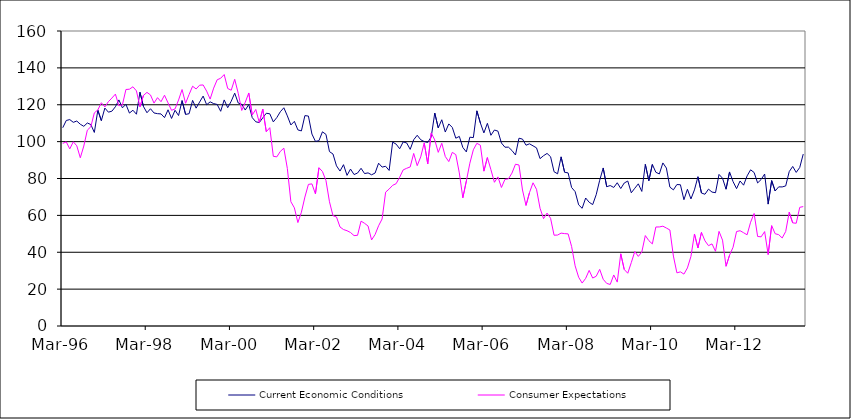
| Category | Current Economic Conditions | Consumer Expectations |
|---|---|---|
| 1996-03-01 | 107.534 | 99.042 |
| 1996-04-01 | 111.468 | 99.873 |
| 1996-05-01 | 111.957 | 96.045 |
| 1996-06-01 | 110.474 | 99.92 |
| 1996-07-01 | 111.168 | 97.726 |
| 1996-08-01 | 109.427 | 91.23 |
| 1996-09-01 | 108.298 | 97.616 |
| 1996-10-01 | 110.108 | 106.207 |
| 1996-11-01 | 109.279 | 108.092 |
| 1996-12-01 | 104.977 | 115.595 |
| 1997-01-01 | 117.038 | 117.194 |
| 1997-02-01 | 111.389 | 121.098 |
| 1997-03-01 | 118.21 | 118.796 |
| 1997-04-01 | 115.979 | 121.671 |
| 1997-05-01 | 116.502 | 123.622 |
| 1997-06-01 | 118.919 | 125.774 |
| 1997-07-01 | 122.622 | 119.453 |
| 1997-08-01 | 118.317 | 119.946 |
| 1997-09-01 | 120.228 | 128.279 |
| 1997-10-01 | 115.49 | 128.434 |
| 1997-11-01 | 117.029 | 129.749 |
| 1997-12-01 | 114.858 | 127.519 |
| 1998-01-01 | 126.797 | 118.85 |
| 1998-02-01 | 119.038 | 125.08 |
| 1998-03-01 | 115.664 | 126.712 |
| 1998-04-01 | 117.832 | 125.305 |
| 1998-05-01 | 115.545 | 120.896 |
| 1998-06-01 | 115.17 | 123.852 |
| 1998-07-01 | 115.024 | 121.661 |
| 1998-08-01 | 113.011 | 125.17 |
| 1998-09-01 | 117.258 | 120.992 |
| 1998-10-01 | 112.572 | 116.994 |
| 1998-11-01 | 117.009 | 117.73 |
| 1998-12-01 | 114.148 | 122.599 |
| 1999-01-01 | 122.261 | 128.24 |
| 1999-02-01 | 114.755 | 120.804 |
| 1999-03-01 | 115.144 | 125.578 |
| 1999-04-01 | 122.37 | 130.05 |
| 1999-05-01 | 118.157 | 128.569 |
| 1999-06-01 | 121.473 | 130.599 |
| 1999-07-01 | 124.698 | 130.738 |
| 1999-08-01 | 120.025 | 127.377 |
| 1999-09-01 | 121.565 | 123.072 |
| 1999-10-01 | 120.628 | 129.024 |
| 1999-11-01 | 120.157 | 133.549 |
| 1999-12-01 | 116.456 | 134.367 |
| 2000-01-01 | 122.625 | 136.39 |
| 2000-02-01 | 118.415 | 128.83 |
| 2000-03-01 | 121.904 | 127.87 |
| 2000-04-01 | 126.291 | 133.808 |
| 2000-05-01 | 120.927 | 126.234 |
| 2000-06-01 | 120.243 | 116.898 |
| 2000-07-01 | 117.132 | 121.315 |
| 2000-08-01 | 120.087 | 126.388 |
| 2000-09-01 | 112.997 | 114.421 |
| 2000-10-01 | 110.759 | 117.451 |
| 2000-11-01 | 110.322 | 110.366 |
| 2000-12-01 | 112.924 | 117.635 |
| 2001-01-01 | 115.391 | 105.36 |
| 2001-02-01 | 115.085 | 107.559 |
| 2001-03-01 | 110.701 | 92.035 |
| 2001-04-01 | 113.07 | 91.744 |
| 2001-05-01 | 116.217 | 94.719 |
| 2001-06-01 | 118.363 | 96.453 |
| 2001-07-01 | 113.96 | 85.411 |
| 2001-08-01 | 109.042 | 67.414 |
| 2001-09-01 | 110.994 | 64.075 |
| 2001-10-01 | 106.361 | 56.085 |
| 2001-11-01 | 105.812 | 61.702 |
| 2001-12-01 | 114.107 | 69.937 |
| 2002-01-01 | 113.87 | 76.81 |
| 2002-02-01 | 104.113 | 77.08 |
| 2002-03-01 | 100.151 | 71.629 |
| 2002-04-01 | 100.503 | 85.831 |
| 2002-05-01 | 105.314 | 83.795 |
| 2002-06-01 | 103.927 | 78.905 |
| 2002-07-01 | 94.586 | 67.374 |
| 2002-08-01 | 93.281 | 59.832 |
| 2002-09-01 | 86.87 | 59.111 |
| 2002-10-01 | 84.038 | 53.696 |
| 2002-11-01 | 87.496 | 52.312 |
| 2002-12-01 | 81.703 | 51.679 |
| 2003-01-01 | 85.115 | 50.696 |
| 2003-02-01 | 82.145 | 49.029 |
| 2003-03-01 | 82.952 | 49.193 |
| 2003-04-01 | 85.542 | 56.879 |
| 2003-05-01 | 82.676 | 55.689 |
| 2003-06-01 | 83.048 | 54.224 |
| 2003-07-01 | 82.005 | 46.672 |
| 2003-08-01 | 82.967 | 49.648 |
| 2003-09-01 | 88.297 | 54.366 |
| 2003-10-01 | 86.186 | 58.069 |
| 2003-11-01 | 86.63 | 72.593 |
| 2003-12-01 | 84.367 | 74.28 |
| 2004-01-01 | 99.728 | 76.295 |
| 2004-02-01 | 98.638 | 77.202 |
| 2004-03-01 | 96.118 | 80.7 |
| 2004-04-01 | 99.845 | 84.661 |
| 2004-05-01 | 99.282 | 85.54 |
| 2004-06-01 | 95.798 | 86.268 |
| 2004-07-01 | 101.024 | 93.601 |
| 2004-08-01 | 103.451 | 86.964 |
| 2004-09-01 | 101.025 | 91.735 |
| 2004-10-01 | 100.027 | 99.325 |
| 2004-11-01 | 99.55 | 87.933 |
| 2004-12-01 | 102.586 | 104.713 |
| 2005-01-01 | 115.494 | 100.93 |
| 2005-02-01 | 107.464 | 94.183 |
| 2005-03-01 | 111.862 | 99.126 |
| 2005-04-01 | 105.202 | 91.93 |
| 2005-05-01 | 109.603 | 89.176 |
| 2005-06-01 | 107.689 | 94.185 |
| 2005-07-01 | 101.855 | 92.95 |
| 2005-08-01 | 102.825 | 83.038 |
| 2005-09-01 | 96.836 | 69.518 |
| 2005-10-01 | 94.419 | 78.597 |
| 2005-11-01 | 102.411 | 88.285 |
| 2005-12-01 | 102.19 | 95.591 |
| 2006-01-01 | 116.697 | 99.091 |
| 2006-02-01 | 110.105 | 98.049 |
| 2006-03-01 | 104.724 | 83.987 |
| 2006-04-01 | 109.919 | 91.366 |
| 2006-05-01 | 103.448 | 84.819 |
| 2006-06-01 | 106.305 | 77.945 |
| 2006-07-01 | 105.691 | 80.872 |
| 2006-08-01 | 99.249 | 75.132 |
| 2006-09-01 | 96.968 | 79.536 |
| 2006-10-01 | 96.994 | 79.805 |
| 2006-11-01 | 95.195 | 82.924 |
| 2006-12-01 | 92.759 | 87.744 |
| 2007-01-01 | 101.857 | 87.327 |
| 2007-02-01 | 101.359 | 73.76 |
| 2007-03-01 | 98.058 | 65.391 |
| 2007-04-01 | 98.812 | 72.362 |
| 2007-05-01 | 97.717 | 77.669 |
| 2007-06-01 | 96.607 | 74.125 |
| 2007-07-01 | 90.78 | 63.876 |
| 2007-08-01 | 92.373 | 58.244 |
| 2007-09-01 | 93.601 | 61.25 |
| 2007-10-01 | 91.814 | 58.415 |
| 2007-11-01 | 83.663 | 49.237 |
| 2007-12-01 | 82.543 | 49.329 |
| 2008-01-01 | 91.739 | 50.379 |
| 2008-02-01 | 83.4 | 50.116 |
| 2008-03-01 | 83.026 | 49.951 |
| 2008-04-01 | 75.099 | 43.093 |
| 2008-05-01 | 72.873 | 32.628 |
| 2008-06-01 | 65.708 | 26.435 |
| 2008-07-01 | 63.831 | 23.287 |
| 2008-08-01 | 69.423 | 25.847 |
| 2008-09-01 | 67.118 | 30.157 |
| 2008-10-01 | 65.853 | 26.003 |
| 2008-11-01 | 71.218 | 26.977 |
| 2008-12-01 | 79.045 | 30.712 |
| 2009-01-01 | 85.714 | 25.335 |
| 2009-02-01 | 75.564 | 23.103 |
| 2009-03-01 | 76.17 | 22.534 |
| 2009-04-01 | 75.15 | 27.683 |
| 2009-05-01 | 77.695 | 23.806 |
| 2009-06-01 | 74.567 | 39.148 |
| 2009-07-01 | 77.567 | 30.628 |
| 2009-08-01 | 78.623 | 28.613 |
| 2009-09-01 | 72.251 | 34.385 |
| 2009-10-01 | 74.711 | 40.397 |
| 2009-11-01 | 77.107 | 37.75 |
| 2009-12-01 | 73 | 40.104 |
| 2010-01-01 | 87.664 | 49.048 |
| 2010-02-01 | 78.828 | 46.301 |
| 2010-03-01 | 87.632 | 44.527 |
| 2010-04-01 | 83.368 | 53.697 |
| 2010-05-01 | 82.476 | 53.722 |
| 2010-06-01 | 88.448 | 54.141 |
| 2010-07-01 | 85.667 | 53.128 |
| 2010-08-01 | 75.33 | 52.073 |
| 2010-09-01 | 73.834 | 37.939 |
| 2010-10-01 | 76.727 | 28.832 |
| 2010-11-01 | 76.617 | 29.359 |
| 2010-12-01 | 68.497 | 28.144 |
| 2011-01-01 | 74.154 | 31.502 |
| 2011-02-01 | 68.927 | 37.76 |
| 2011-03-01 | 73.837 | 49.903 |
| 2011-04-01 | 80.952 | 42.321 |
| 2011-05-01 | 72.107 | 50.793 |
| 2011-06-01 | 71.459 | 46.185 |
| 2011-07-01 | 74.226 | 43.574 |
| 2011-08-01 | 72.63 | 44.527 |
| 2011-09-01 | 72.29 | 40.487 |
| 2011-10-01 | 82.204 | 51.323 |
| 2011-11-01 | 80.147 | 46.574 |
| 2011-12-01 | 74.201 | 32.391 |
| 2012-01-01 | 83.552 | 38.392 |
| 2012-02-01 | 78.322 | 42.713 |
| 2012-03-01 | 74.499 | 51.243 |
| 2012-04-01 | 78.652 | 51.686 |
| 2012-05-01 | 76.38 | 50.586 |
| 2012-06-01 | 81.402 | 49.468 |
| 2012-07-01 | 84.714 | 56.291 |
| 2012-08-01 | 83.25 | 61.037 |
| 2012-09-01 | 77.586 | 48.567 |
| 2012-10-01 | 79.468 | 48.352 |
| 2012-11-01 | 82.413 | 51.207 |
| 2012-12-01 | 66.11 | 38.751 |
| 2013-01-01 | 78.843 | 54.431 |
| 2013-02-01 | 73.235 | 50.041 |
| 2013-03-01 | 75.461 | 49.547 |
| 2013-04-01 | 75.429 | 47.738 |
| 2013-05-01 | 75.966 | 51.26 |
| 2013-06-01 | 83.724 | 61.712 |
| 2013-07-01 | 86.526 | 55.932 |
| 2013-08-01 | 83.309 | 55.724 |
| 2013-09-01 | 85.981 | 64.359 |
| 2013-10-01 | 93.254 | 64.772 |